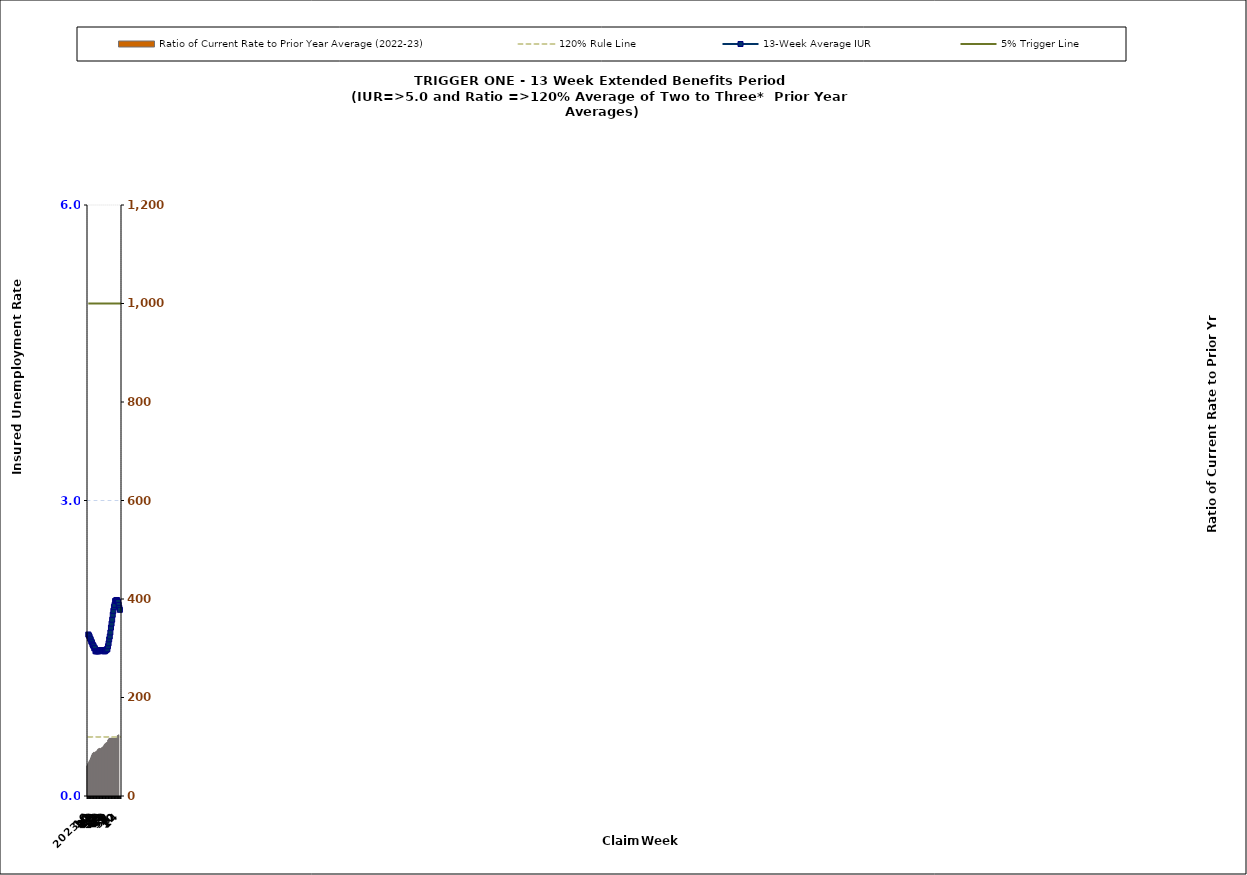
| Category | Ratio of Current Rate to Prior Year Average (2022-23) |
|---|---|
| 2023-14 | 61.19 |
| 15 | 63.79 |
| 16 | 66.8 |
| 17 | 69.41 |
| 18 | 71.78 |
| 19 | 73.7 |
| 20 | 77.22 |
| 21 | 80 |
| 22 | 83.37 |
| 23 | 86.11 |
| 24 | 87.2 |
| 25 | 88.75 |
| 26 | 87.5 |
| 27 | 88.82 |
| 28 | 89.63 |
| 29 | 90.18 |
| 30 | 90.74 |
| 31 | 93.03 |
| 32 | 94.53 |
| 33 | 95.79 |
| 34 | 96.1 |
| 35 | 97.04 |
| 36 | 96.1 |
| 37 | 96.41 |
| 38 | 97.68 |
| 39 | 98.33 |
| 40 | 98.98 |
| 41 | 100.68 |
| 42 | 102.08 |
| 43 | 104.22 |
| 44 | 105.71 |
| 45 | 106.81 |
| 46 | 107.97 |
| 47 | 108.57 |
| 48 | 109.54 |
| 49 | 113.57 |
| 50 | 115.71 |
| 51 | 116.9 |
| 52 | 117.52 |
| 1 | 117.44 |
| 2 | 116.99 |
| 3 | 117.94 |
| 4 | 117.86 |
| 5 | 118.15 |
| 6 | 118.29 |
| 7 | 118.2 |
| 8 | 117.85 |
| 9 | 118.45 |
| 10 | 118.8 |
| 11 | 118.91 |
| 12 | 119.75 |
| 13 | 122.78 |
| 14 | 123.22 |
| 2024-15 | 124.34 |